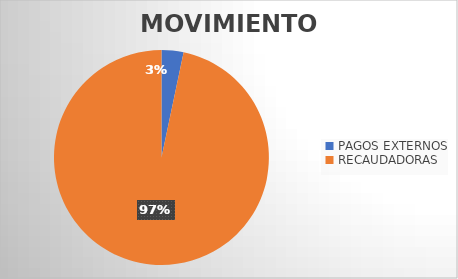
| Category | MOVIMIENTOS |
|---|---|
| PAGOS EXTERNOS | 584 |
| RECAUDADORAS | 17093 |